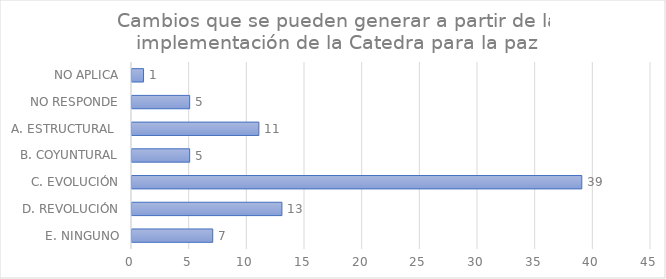
| Category | Series 0 |
|---|---|
| E. NINGUNO | 7 |
| D. REVOLUCIÓN | 13 |
| C. EVOLUCIÓN | 39 |
| B. COYUNTURAL | 5 |
| A. ESTRUCTURAL  | 11 |
| NO RESPONDE | 5 |
| NO APLICA | 1 |